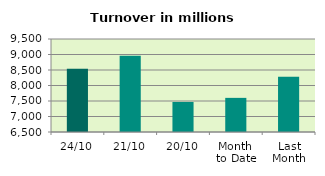
| Category | Series 0 |
|---|---|
| 24/10 | 8543.066 |
| 21/10 | 8960.29 |
| 20/10 | 7469.415 |
| Month 
to Date | 7600.945 |
| Last
Month | 8284.199 |